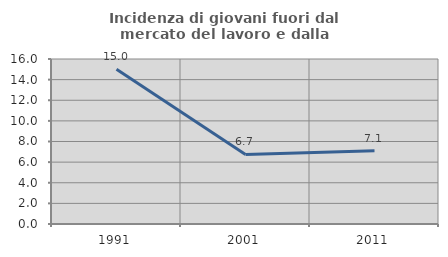
| Category | Incidenza di giovani fuori dal mercato del lavoro e dalla formazione  |
|---|---|
| 1991.0 | 15.017 |
| 2001.0 | 6.742 |
| 2011.0 | 7.104 |